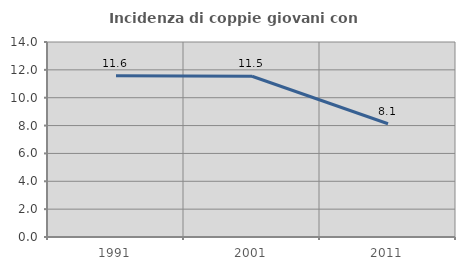
| Category | Incidenza di coppie giovani con figli |
|---|---|
| 1991.0 | 11.574 |
| 2001.0 | 11.538 |
| 2011.0 | 8.13 |